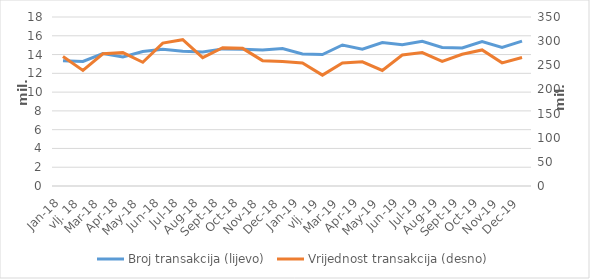
| Category | Broj transakcija (lijevo) |
|---|---|
| sij.18 | 13342931 |
| vlj. 18 | 13272441 |
| ožu.18 | 14113179 |
| tra.18 | 13744326 |
| svi.18 | 14320544 |
| lip.18 | 14562190 |
| srp.18 | 14358474 |
| kol.18 | 14278622 |
| ruj.18 | 14603466 |
| lis.18 | 14562545 |
| stu.18 | 14485909 |
| pro.18 | 14636781 |
| sij.19 | 14051758 |
| vlj. 19 | 13993705 |
| ožu.19 | 15018362 |
| tra.19 | 14573386 |
| svi.19 | 15274233 |
| lip.19 | 15041226 |
| srp.19 | 15403097 |
| kol.19 | 14762747 |
| ruj.19 | 14697605 |
| lis.19 | 15394413 |
| stu.19 | 14755458 |
| pro.19 | 15431812 |